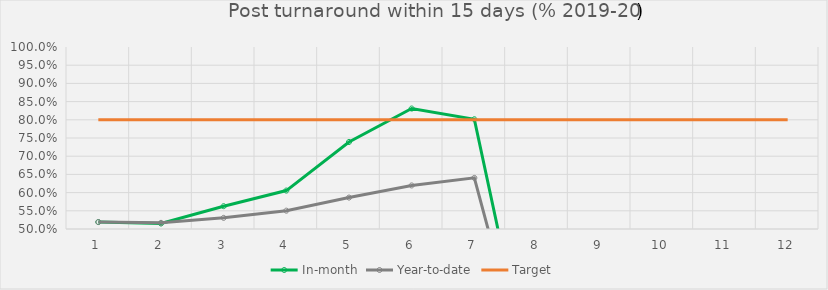
| Category | In-month | Year-to-date | Target |
|---|---|---|---|
| 0 | 0.519 | 0.519 | 0.8 |
| 1 | 0.515 | 0.517 | 0.8 |
| 2 | 0.563 | 0.531 | 0.8 |
| 3 | 0.606 | 0.55 | 0.8 |
| 4 | 0.739 | 0.586 | 0.8 |
| 5 | 0.831 | 0.62 | 0.8 |
| 6 | 0.802 | 0.64 | 0.8 |
| 7 | 0 | 0 | 0.8 |
| 8 | 0 | 0 | 0.8 |
| 9 | 0 | 0 | 0.8 |
| 10 | 0 | 0 | 0.8 |
| 11 | 0 | 0 | 0.8 |